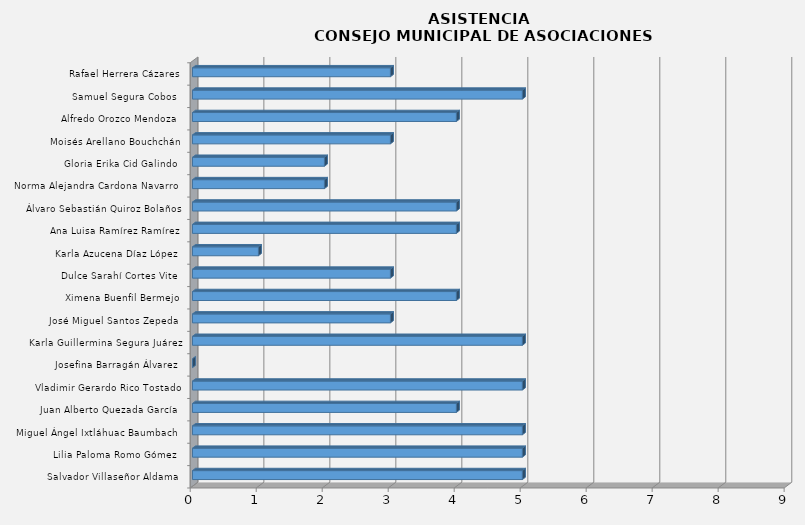
| Category | Series 0 |
|---|---|
| Salvador Villaseñor Aldama  | 5 |
| Lilia Paloma Romo Gómez  | 5 |
| Miguel Ángel Ixtláhuac Baumbach  | 5 |
| Juan Alberto Quezada García  | 4 |
| Vladimir Gerardo Rico Tostado | 5 |
| Josefina Barragán Álvarez  | 0 |
| Karla Guillermina Segura Juárez | 5 |
| José Miguel Santos Zepeda  | 3 |
| Ximena Buenfil Bermejo | 4 |
| Dulce Sarahí Cortes Vite  | 3 |
| Karla Azucena Díaz López  | 1 |
| Ana Luisa Ramírez Ramírez | 4 |
| Álvaro Sebastián Quiroz Bolaños | 4 |
| Norma Alejandra Cardona Navarro  | 2 |
| Gloria Erika Cid Galindo  | 2 |
| Moisés Arellano Bouchchán | 3 |
| Alfredo Orozco Mendoza  | 4 |
| Samuel Segura Cobos  | 5 |
| Rafael Herrera Cázares | 3 |